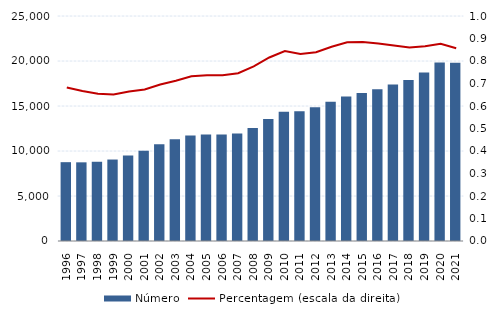
| Category | Número |
|---|---|
| 1996.0 | 8759 |
| 1997.0 | 8741 |
| 1998.0 | 8805 |
| 1999.0 | 9052 |
| 2000.0 | 9509 |
| 2001.0 | 10030 |
| 2002.0 | 10762 |
| 2003.0 | 11300 |
| 2004.0 | 11729 |
| 2005.0 | 11833 |
| 2006.0 | 11823 |
| 2007.0 | 11940 |
| 2008.0 | 12569 |
| 2009.0 | 13553 |
| 2010.0 | 14356 |
| 2011.0 | 14430 |
| 2012.0 | 14868 |
| 2013.0 | 15486 |
| 2014.0 | 16054 |
| 2015.0 | 16456 |
| 2016.0 | 16868 |
| 2017.0 | 17384 |
| 2018.0 | 17893 |
| 2019.0 | 18713 |
| 2020.0 | 19820 |
| 2021.0 | 19816 |